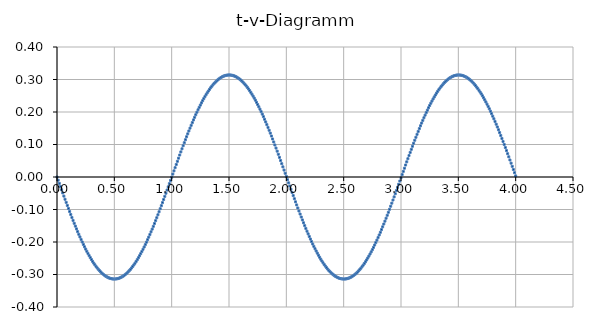
| Category | Series 0 |
|---|---|
| 0.0 | 0 |
| 0.01 | -0.01 |
| 0.02 | -0.02 |
| 0.03 | -0.03 |
| 0.04 | -0.039 |
| 0.05 | -0.049 |
| 0.06 | -0.059 |
| 0.07 | -0.068 |
| 0.08 | -0.078 |
| 0.09 | -0.088 |
| 0.1 | -0.097 |
| 0.11 | -0.106 |
| 0.12 | -0.115 |
| 0.13 | -0.125 |
| 0.14 | -0.134 |
| 0.15 | -0.142 |
| 0.16 | -0.151 |
| 0.17 | -0.16 |
| 0.18 | -0.168 |
| 0.19 | -0.176 |
| 0.2 | -0.184 |
| 0.21 | -0.192 |
| 0.22 | -0.2 |
| 0.23 | -0.207 |
| 0.24 | -0.215 |
| 0.25 | -0.222 |
| 0.26 | -0.229 |
| 0.27 | -0.235 |
| 0.28 | -0.242 |
| 0.29 | -0.248 |
| 0.3 | -0.254 |
| 0.31 | -0.259 |
| 0.32 | -0.265 |
| 0.33 | -0.27 |
| 0.34 | -0.275 |
| 0.35 | -0.28 |
| 0.36 | -0.284 |
| 0.37 | -0.288 |
| 0.38 | -0.292 |
| 0.39 | -0.295 |
| 0.4 | -0.298 |
| 0.41 | -0.301 |
| 0.42 | -0.304 |
| 0.43 | -0.306 |
| 0.44 | -0.308 |
| 0.45 | -0.31 |
| 0.46 | -0.311 |
| 0.47 | -0.312 |
| 0.48 | -0.313 |
| 0.49 | -0.314 |
| 0.5 | -0.314 |
| 0.51 | -0.314 |
| 0.52 | -0.313 |
| 0.53 | -0.313 |
| 0.54 | -0.312 |
| 0.55 | -0.31 |
| 0.56 | -0.308 |
| 0.57 | -0.306 |
| 0.58 | -0.304 |
| 0.59 | -0.302 |
| 0.6 | -0.299 |
| 0.61 | -0.296 |
| 0.62 | -0.292 |
| 0.63 | -0.288 |
| 0.64 | -0.284 |
| 0.65 | -0.28 |
| 0.66 | -0.275 |
| 0.67 | -0.27 |
| 0.68 | -0.265 |
| 0.69 | -0.26 |
| 0.7 | -0.254 |
| 0.71 | -0.248 |
| 0.72 | -0.242 |
| 0.73 | -0.236 |
| 0.74 | -0.229 |
| 0.75 | -0.222 |
| 0.76 | -0.215 |
| 0.77 | -0.208 |
| 0.78 | -0.201 |
| 0.790000000000001 | -0.193 |
| 0.8 | -0.185 |
| 0.810000000000001 | -0.177 |
| 0.82 | -0.169 |
| 0.83 | -0.16 |
| 0.84 | -0.152 |
| 0.850000000000001 | -0.143 |
| 0.860000000000001 | -0.134 |
| 0.87 | -0.125 |
| 0.88 | -0.116 |
| 0.890000000000001 | -0.107 |
| 0.900000000000001 | -0.098 |
| 0.910000000000001 | -0.088 |
| 0.92 | -0.079 |
| 0.930000000000001 | -0.069 |
| 0.940000000000001 | -0.06 |
| 0.950000000000001 | -0.05 |
| 0.960000000000001 | -0.04 |
| 0.970000000000001 | -0.03 |
| 0.980000000000001 | -0.021 |
| 0.990000000000001 | -0.011 |
| 1.0 | -0.001 |
| 1.01 | 0.009 |
| 1.02 | 0.019 |
| 1.03 | 0.029 |
| 1.04 | 0.038 |
| 1.05 | 0.048 |
| 1.06 | 0.058 |
| 1.07 | 0.068 |
| 1.08 | 0.077 |
| 1.09 | 0.087 |
| 1.1 | 0.096 |
| 1.11 | 0.105 |
| 1.12 | 0.115 |
| 1.13 | 0.124 |
| 1.14 | 0.133 |
| 1.15 | 0.142 |
| 1.16 | 0.15 |
| 1.17 | 0.159 |
| 1.18 | 0.167 |
| 1.19 | 0.176 |
| 1.2 | 0.184 |
| 1.21 | 0.192 |
| 1.22 | 0.199 |
| 1.23 | 0.207 |
| 1.24 | 0.214 |
| 1.25 | 0.221 |
| 1.26 | 0.228 |
| 1.27 | 0.235 |
| 1.28 | 0.241 |
| 1.29 | 0.247 |
| 1.3 | 0.253 |
| 1.31 | 0.259 |
| 1.32 | 0.264 |
| 1.33 | 0.27 |
| 1.34 | 0.275 |
| 1.35 | 0.279 |
| 1.36 | 0.284 |
| 1.37 | 0.288 |
| 1.38 | 0.291 |
| 1.39 | 0.295 |
| 1.4 | 0.298 |
| 1.41 | 0.301 |
| 1.42 | 0.304 |
| 1.43 | 0.306 |
| 1.44 | 0.308 |
| 1.45 | 0.31 |
| 1.46 | 0.311 |
| 1.47 | 0.312 |
| 1.48 | 0.313 |
| 1.49 | 0.314 |
| 1.5 | 0.314 |
| 1.51 | 0.314 |
| 1.52 | 0.313 |
| 1.53 | 0.313 |
| 1.54 | 0.312 |
| 1.55 | 0.31 |
| 1.56 | 0.309 |
| 1.57 | 0.307 |
| 1.58 | 0.304 |
| 1.59 | 0.302 |
| 1.6 | 0.299 |
| 1.61 | 0.296 |
| 1.62 | 0.292 |
| 1.63 | 0.289 |
| 1.64 | 0.285 |
| 1.65 | 0.28 |
| 1.66 | 0.276 |
| 1.67 | 0.271 |
| 1.68 | 0.266 |
| 1.69 | 0.26 |
| 1.7 | 0.255 |
| 1.71 | 0.249 |
| 1.72 | 0.243 |
| 1.73 | 0.236 |
| 1.74 | 0.23 |
| 1.75 | 0.223 |
| 1.76 | 0.216 |
| 1.77 | 0.209 |
| 1.78 | 0.201 |
| 1.79 | 0.194 |
| 1.8 | 0.186 |
| 1.81 | 0.178 |
| 1.82 | 0.169 |
| 1.83 | 0.161 |
| 1.84 | 0.153 |
| 1.85 | 0.144 |
| 1.86 | 0.135 |
| 1.87 | 0.126 |
| 1.88 | 0.117 |
| 1.89 | 0.108 |
| 1.9 | 0.099 |
| 1.91 | 0.089 |
| 1.92 | 0.08 |
| 1.93 | 0.07 |
| 1.94 | 0.06 |
| 1.95 | 0.051 |
| 1.96 | 0.041 |
| 1.97 | 0.031 |
| 1.98 | 0.021 |
| 1.99 | 0.012 |
| 2.0 | 0.002 |
| 2.01 | -0.008 |
| 2.02 | -0.018 |
| 2.03 | -0.028 |
| 2.04 | -0.038 |
| 2.05 | -0.047 |
| 2.06 | -0.057 |
| 2.07 | -0.067 |
| 2.08 | -0.076 |
| 2.09 | -0.086 |
| 2.1 | -0.095 |
| 2.11 | -0.105 |
| 2.12 | -0.114 |
| 2.13 | -0.123 |
| 2.14 | -0.132 |
| 2.15 | -0.141 |
| 2.16 | -0.15 |
| 2.17 | -0.158 |
| 2.18 | -0.167 |
| 2.19 | -0.175 |
| 2.2 | -0.183 |
| 2.21 | -0.191 |
| 2.22 | -0.199 |
| 2.23 | -0.206 |
| 2.24 | -0.214 |
| 2.25 | -0.221 |
| 2.26 | -0.228 |
| 2.27 | -0.234 |
| 2.28 | -0.241 |
| 2.29 | -0.247 |
| 2.29999999999999 | -0.253 |
| 2.30999999999999 | -0.259 |
| 2.31999999999999 | -0.264 |
| 2.32999999999999 | -0.269 |
| 2.33999999999999 | -0.274 |
| 2.34999999999999 | -0.279 |
| 2.35999999999999 | -0.283 |
| 2.36999999999999 | -0.287 |
| 2.37999999999999 | -0.291 |
| 2.38999999999999 | -0.295 |
| 2.39999999999999 | -0.298 |
| 2.40999999999999 | -0.301 |
| 2.41999999999999 | -0.304 |
| 2.42999999999999 | -0.306 |
| 2.43999999999999 | -0.308 |
| 2.44999999999999 | -0.31 |
| 2.45999999999999 | -0.311 |
| 2.46999999999999 | -0.312 |
| 2.47999999999999 | -0.313 |
| 2.48999999999999 | -0.314 |
| 2.49999999999999 | -0.314 |
| 2.50999999999999 | -0.314 |
| 2.51999999999999 | -0.313 |
| 2.52999999999999 | -0.313 |
| 2.53999999999999 | -0.312 |
| 2.54999999999999 | -0.31 |
| 2.55999999999999 | -0.309 |
| 2.56999999999999 | -0.307 |
| 2.57999999999999 | -0.305 |
| 2.58999999999999 | -0.302 |
| 2.59999999999999 | -0.299 |
| 2.60999999999999 | -0.296 |
| 2.61999999999999 | -0.293 |
| 2.62999999999999 | -0.289 |
| 2.63999999999999 | -0.285 |
| 2.64999999999999 | -0.281 |
| 2.65999999999999 | -0.276 |
| 2.66999999999999 | -0.271 |
| 2.67999999999999 | -0.266 |
| 2.68999999999999 | -0.261 |
| 2.69999999999999 | -0.255 |
| 2.70999999999999 | -0.249 |
| 2.71999999999999 | -0.243 |
| 2.72999999999999 | -0.237 |
| 2.73999999999999 | -0.23 |
| 2.74999999999999 | -0.224 |
| 2.75999999999999 | -0.217 |
| 2.76999999999998 | -0.209 |
| 2.77999999999998 | -0.202 |
| 2.78999999999998 | -0.194 |
| 2.79999999999998 | -0.186 |
| 2.80999999999998 | -0.178 |
| 2.81999999999998 | -0.17 |
| 2.82999999999998 | -0.162 |
| 2.83999999999998 | -0.153 |
| 2.84999999999998 | -0.145 |
| 2.85999999999998 | -0.136 |
| 2.86999999999998 | -0.127 |
| 2.87999999999998 | -0.118 |
| 2.88999999999998 | -0.109 |
| 2.89999999999998 | -0.099 |
| 2.90999999999998 | -0.09 |
| 2.91999999999998 | -0.08 |
| 2.92999999999998 | -0.071 |
| 2.93999999999998 | -0.061 |
| 2.94999999999998 | -0.052 |
| 2.95999999999998 | -0.042 |
| 2.96999999999998 | -0.032 |
| 2.97999999999998 | -0.022 |
| 2.98999999999998 | -0.012 |
| 2.99999999999998 | -0.002 |
| 3.00999999999998 | 0.007 |
| 3.01999999999998 | 0.017 |
| 3.02999999999998 | 0.027 |
| 3.03999999999998 | 0.037 |
| 3.04999999999998 | 0.047 |
| 3.05999999999998 | 0.056 |
| 3.06999999999998 | 0.066 |
| 3.07999999999998 | 0.076 |
| 3.08999999999998 | 0.085 |
| 3.09999999999998 | 0.095 |
| 3.10999999999998 | 0.104 |
| 3.11999999999998 | 0.113 |
| 3.12999999999998 | 0.122 |
| 3.13999999999998 | 0.131 |
| 3.14999999999998 | 0.14 |
| 3.15999999999998 | 0.149 |
| 3.16999999999998 | 0.158 |
| 3.17999999999998 | 0.166 |
| 3.18999999999998 | 0.174 |
| 3.19999999999998 | 0.182 |
| 3.20999999999998 | 0.19 |
| 3.21999999999998 | 0.198 |
| 3.22999999999997 | 0.206 |
| 3.23999999999997 | 0.213 |
| 3.24999999999997 | 0.22 |
| 3.25999999999997 | 0.227 |
| 3.26999999999997 | 0.234 |
| 3.27999999999997 | 0.24 |
| 3.28999999999997 | 0.246 |
| 3.29999999999997 | 0.252 |
| 3.30999999999997 | 0.258 |
| 3.31999999999997 | 0.264 |
| 3.32999999999997 | 0.269 |
| 3.33999999999997 | 0.274 |
| 3.34999999999997 | 0.278 |
| 3.35999999999997 | 0.283 |
| 3.36999999999997 | 0.287 |
| 3.37999999999997 | 0.291 |
| 3.38999999999997 | 0.294 |
| 3.39999999999997 | 0.298 |
| 3.40999999999997 | 0.301 |
| 3.41999999999997 | 0.303 |
| 3.42999999999997 | 0.306 |
| 3.43999999999997 | 0.308 |
| 3.44999999999997 | 0.31 |
| 3.45999999999997 | 0.311 |
| 3.46999999999997 | 0.312 |
| 3.47999999999997 | 0.313 |
| 3.48999999999997 | 0.314 |
| 3.49999999999997 | 0.314 |
| 3.50999999999997 | 0.314 |
| 3.51999999999997 | 0.313 |
| 3.52999999999997 | 0.313 |
| 3.53999999999997 | 0.312 |
| 3.54999999999997 | 0.311 |
| 3.55999999999997 | 0.309 |
| 3.56999999999997 | 0.307 |
| 3.57999999999997 | 0.305 |
| 3.58999999999997 | 0.302 |
| 3.59999999999997 | 0.299 |
| 3.60999999999997 | 0.296 |
| 3.61999999999997 | 0.293 |
| 3.62999999999997 | 0.289 |
| 3.63999999999997 | 0.285 |
| 3.64999999999997 | 0.281 |
| 3.65999999999997 | 0.277 |
| 3.66999999999997 | 0.272 |
| 3.67999999999997 | 0.267 |
| 3.68999999999997 | 0.261 |
| 3.69999999999996 | 0.256 |
| 3.70999999999996 | 0.25 |
| 3.71999999999996 | 0.244 |
| 3.72999999999996 | 0.238 |
| 3.73999999999996 | 0.231 |
| 3.74999999999996 | 0.224 |
| 3.75999999999996 | 0.217 |
| 3.76999999999996 | 0.21 |
| 3.77999999999996 | 0.203 |
| 3.78999999999996 | 0.195 |
| 3.79999999999996 | 0.187 |
| 3.80999999999996 | 0.179 |
| 3.81999999999996 | 0.171 |
| 3.82999999999996 | 0.163 |
| 3.83999999999996 | 0.154 |
| 3.84999999999996 | 0.145 |
| 3.85999999999996 | 0.137 |
| 3.86999999999996 | 0.128 |
| 3.87999999999996 | 0.119 |
| 3.88999999999996 | 0.109 |
| 3.89999999999996 | 0.1 |
| 3.90999999999996 | 0.091 |
| 3.91999999999996 | 0.081 |
| 3.92999999999996 | 0.072 |
| 3.93999999999996 | 0.062 |
| 3.94999999999996 | 0.052 |
| 3.95999999999996 | 0.043 |
| 3.96999999999996 | 0.033 |
| 3.97999999999996 | 0.023 |
| 3.98999999999996 | 0.013 |
| 3.99999999999996 | 0.003 |